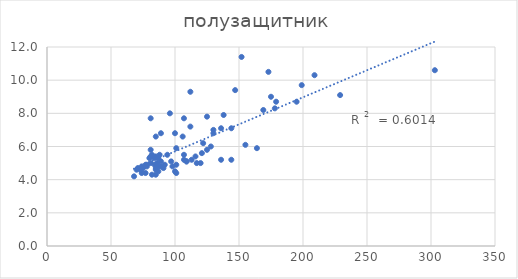
| Category | Series 0 |
|---|---|
| 303.0 | 10.6 |
| 229.0 | 9.1 |
| 209.0 | 10.3 |
| 199.0 | 9.7 |
| 195.0 | 8.7 |
| 179.0 | 8.7 |
| 178.0 | 8.3 |
| 175.0 | 9 |
| 173.0 | 10.5 |
| 169.0 | 8.2 |
| 164.0 | 5.9 |
| 155.0 | 6.1 |
| 152.0 | 11.4 |
| 147.0 | 9.4 |
| 144.0 | 5.2 |
| 144.0 | 7.1 |
| 138.0 | 7.9 |
| 136.0 | 5.2 |
| 136.0 | 7.1 |
| 130.0 | 6.8 |
| 130.0 | 7 |
| 128.0 | 6 |
| 125.0 | 5.8 |
| 125.0 | 7.8 |
| 122.0 | 6.2 |
| 121.0 | 5.6 |
| 120.0 | 5 |
| 117.0 | 5 |
| 116.0 | 5.4 |
| 113.0 | 5.2 |
| 112.0 | 7.2 |
| 112.0 | 9.3 |
| 109.0 | 5.1 |
| 109.0 | 5.1 |
| 107.0 | 5.2 |
| 107.0 | 5.5 |
| 107.0 | 7.7 |
| 106.0 | 6.6 |
| 101.0 | 4.4 |
| 101.0 | 4.9 |
| 101.0 | 5.9 |
| 100.0 | 4.5 |
| 100.0 | 6.8 |
| 98.0 | 4.8 |
| 97.0 | 5.1 |
| 96.0 | 8 |
| 94.0 | 5.5 |
| 92.0 | 4.9 |
| 91.0 | 4.7 |
| 89.0 | 4.8 |
| 89.0 | 5.1 |
| 89.0 | 6.8 |
| 88.0 | 5.5 |
| 87.0 | 4.5 |
| 87.0 | 4.8 |
| 87.0 | 5.3 |
| 86.0 | 5 |
| 85.0 | 4.3 |
| 85.0 | 4.6 |
| 85.0 | 4.7 |
| 85.0 | 5.4 |
| 85.0 | 6.6 |
| 84.0 | 4.9 |
| 84.0 | 5.3 |
| 82.0 | 4.3 |
| 82.0 | 5.4 |
| 82.0 | 5.5 |
| 81.0 | 5 |
| 81.0 | 5.4 |
| 81.0 | 5.8 |
| 81.0 | 7.7 |
| 80.0 | 5.3 |
| 78.0 | 4.8 |
| 78.0 | 4.9 |
| 77.0 | 4.4 |
| 77.0 | 4.9 |
| 75.0 | 4.7 |
| 74.0 | 4.4 |
| 74.0 | 4.8 |
| 73.0 | 4.6 |
| 71.0 | 4.7 |
| 70.0 | 4.6 |
| 68.0 | 4.2 |